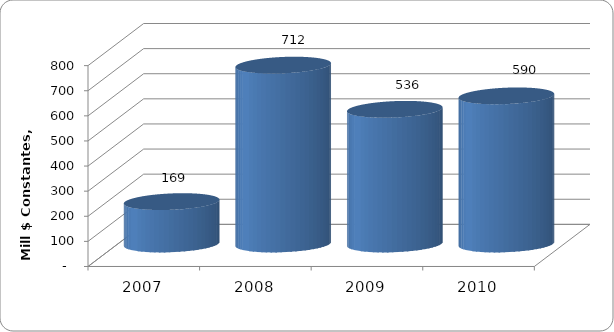
| Category | SALDO DE DEUDA |
|---|---|
| 2007 | 168.824 |
| 2008 | 712.43 |
| 2009 | 536.484 |
| 2010 | 590 |